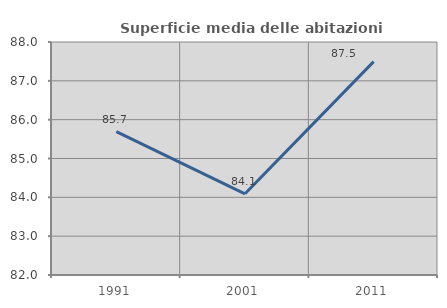
| Category | Superficie media delle abitazioni occupate |
|---|---|
| 1991.0 | 85.692 |
| 2001.0 | 84.091 |
| 2011.0 | 87.495 |